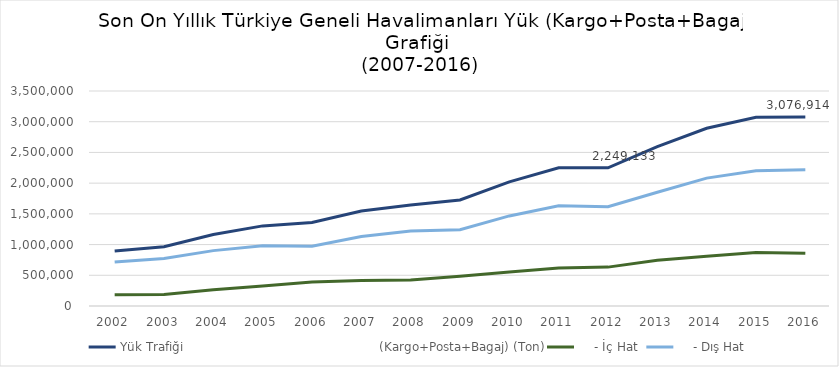
| Category | Yük Trafiği                                                 (Kargo+Posta+Bagaj) (Ton) |     - İç Hat |     - Dış Hat |
|---|---|---|---|
| 2002.0 | 896865 | 181262 | 715603 |
| 2003.0 | 964080 | 188979 | 775101 |
| 2004.0 | 1164349 | 262790 | 901559 |
| 2005.0 | 1304241 | 324597 | 979644 |
| 2006.0 | 1360550 | 389206 | 971344 |
| 2007.0 | 1546184 | 414294 | 1131890 |
| 2008.0 | 1644014 | 424555 | 1219459 |
| 2009.0 | 1726345 | 484833 | 1241512 |
| 2010.0 | 2021076 | 554710 | 1466366 |
| 2011.0 | 2249473.235 | 617834.589 | 1631638.646 |
| 2012.0 | 2249133 | 633076 | 1616057 |
| 2013.0 | 2595317 | 744028 | 1851289 |
| 2014.0 | 2893000.13 | 810858 | 2082142.13 |
| 2015.0 | 3072831 | 871327 | 2201504 |
| 2016.0 | 3076913.699 | 857335.195 | 2219578.504 |